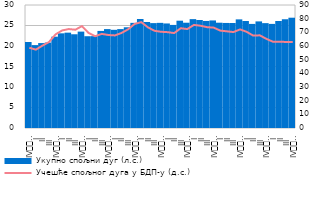
| Category | Укупно спољни дуг (л.с.) |
|---|---|
| IV
2008. | 20.982 |
| I | 20.211 |
| II | 20.713 |
| III | 20.839 |
| IV
2009. | 22.272 |
| I | 23.09 |
| II | 23.254 |
| III | 22.861 |
| IV
2010. | 23.509 |
| I | 22.384 |
| II | 22.4 |
| III | 23.676 |
| IV
2011. | 24.123 |
| I | 23.947 |
| II | 24.124 |
| III | 24.565 |
| IV
2012. | 25.645 |
| I | 26.582 |
| II | 25.858 |
| III | 25.582 |
| IV
2013. | 25.644 |
| I | 25.497 |
| II | 25.144 |
| III | 26.171 |
| IV
2014. | 25.679 |
| I | 26.552 |
| II | 26.348 |
| III | 26.111 |
| IV
2015. | 26.234 |
| I | 25.682 |
| II | 25.621 |
| III | 25.603 |
| IV
2016. | 26.494 |
| I | 26.091 |
| II | 25.389 |
| III | 25.999 |
| IV
2017. | 25.578 |
| I | 25.392 |
| II | 26.101 |
| III | 26.524 |
| IV
2018. | 26.901 |